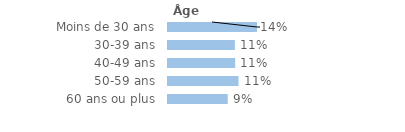
| Category | Series 0 |
|---|---|
| Moins de 30 ans | 0.141 |
| 30-39 ans | 0.106 |
| 40-49 ans | 0.107 |
| 50-59 ans | 0.112 |
| 60 ans ou plus | 0.095 |